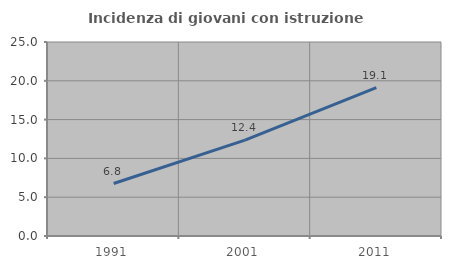
| Category | Incidenza di giovani con istruzione universitaria |
|---|---|
| 1991.0 | 6.762 |
| 2001.0 | 12.357 |
| 2011.0 | 19.11 |